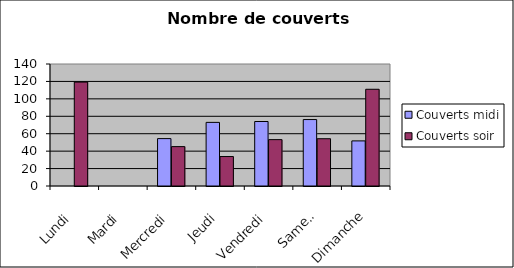
| Category | Couverts |
|---|---|
| Lundi | 119.25 |
| Mardi | 0 |
| Mercredi | 45.2 |
| Jeudi | 33.8 |
| Vendredi | 53.2 |
| Samedi | 54.25 |
| Dimanche | 111 |